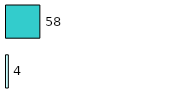
| Category | Series 0 | Series 1 |
|---|---|---|
| 0 | 4 | 58 |